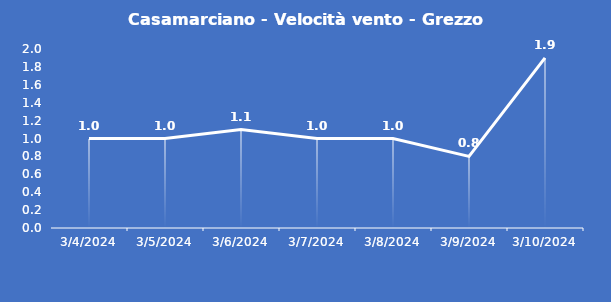
| Category | Casamarciano - Velocità vento - Grezzo (m/s) |
|---|---|
| 3/4/24 | 1 |
| 3/5/24 | 1 |
| 3/6/24 | 1.1 |
| 3/7/24 | 1 |
| 3/8/24 | 1 |
| 3/9/24 | 0.8 |
| 3/10/24 | 1.9 |